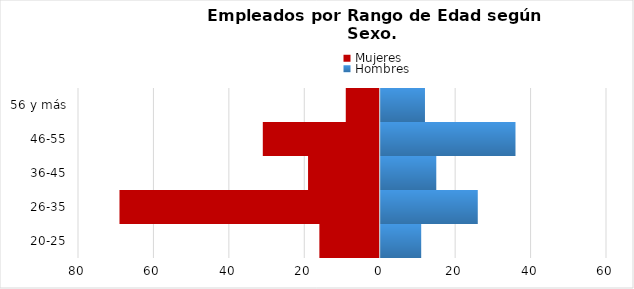
| Category | Mujeres | Hombres |
|---|---|---|
| 20-25 | -16 | 11 |
| 26-35 | -69 | 26 |
| 36-45 | -19 | 15 |
| 46-55 | -31 | 36 |
| 56 y más | -9 | 12 |